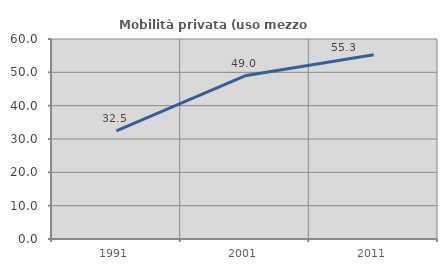
| Category | Mobilità privata (uso mezzo privato) |
|---|---|
| 1991.0 | 32.468 |
| 2001.0 | 48.971 |
| 2011.0 | 55.289 |